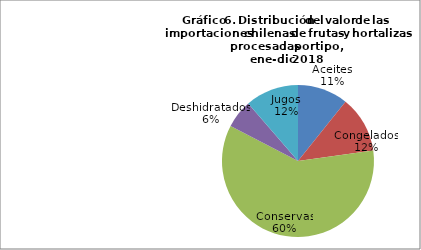
| Category | Series 0 |
|---|---|
| Aceites | 43706121.73 |
| Congelados | 49067628.64 |
| Conservas | 243490658.07 |
| Deshidratados | 24455260.08 |
| Jugos | 46251202.7 |